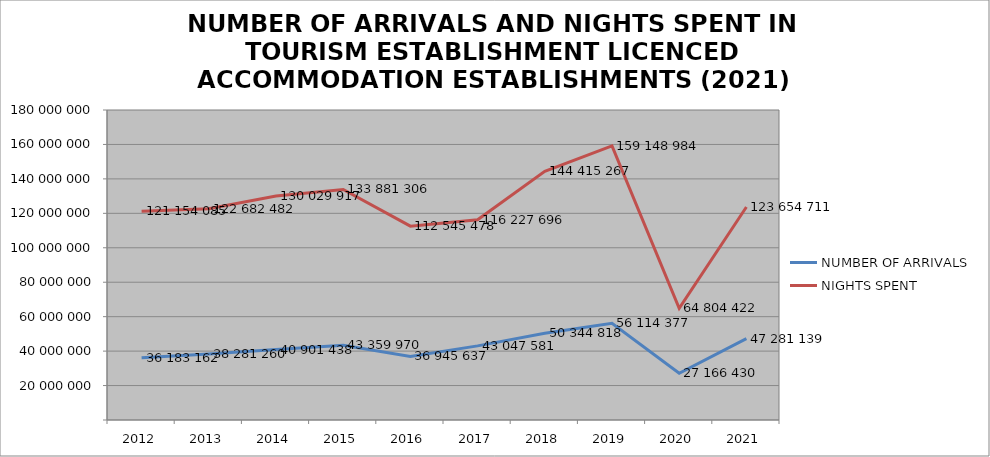
| Category | NUMBER OF ARRIVALS | NIGHTS SPENT |
|---|---|---|
| 2012 | 36183162 | 121154085 |
| 2013 | 38281260 | 122682482 |
| 2014 | 40901438 | 130029917 |
| 2015 | 43359970 | 133881306 |
| 2016 | 36945637 | 112545478 |
| 2017 | 43047581 | 116227696 |
| 2018 | 50344818 | 144415267 |
| 2019 | 56114377 | 159148984 |
| 2020 | 27166430 | 64804422 |
| 2021 | 47281139 | 123654711 |